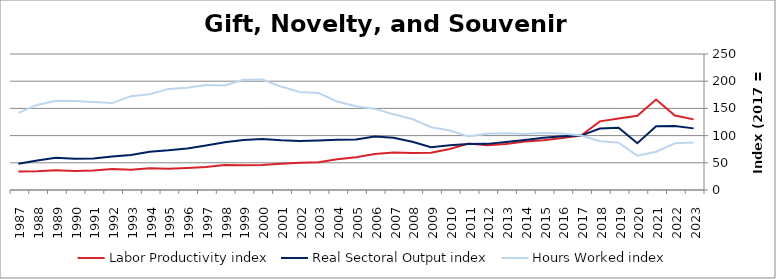
| Category | Labor Productivity index | Real Sectoral Output index | Hours Worked index |
|---|---|---|---|
| 2023.0 | 129.848 | 113.267 | 87.231 |
| 2022.0 | 137.019 | 117.731 | 85.923 |
| 2021.0 | 166.224 | 117.076 | 70.433 |
| 2020.0 | 136.283 | 86.102 | 63.179 |
| 2019.0 | 131.521 | 114.574 | 87.115 |
| 2018.0 | 126.127 | 113.036 | 89.621 |
| 2017.0 | 100 | 100 | 100 |
| 2016.0 | 95.467 | 98.997 | 103.698 |
| 2015.0 | 91.502 | 96.053 | 104.974 |
| 2014.0 | 89.359 | 92.098 | 103.065 |
| 2013.0 | 84.581 | 88.285 | 104.379 |
| 2012.0 | 82.145 | 84.794 | 103.224 |
| 2011.0 | 85.568 | 84.377 | 98.608 |
| 2010.0 | 75.236 | 82.262 | 109.338 |
| 2009.0 | 68.289 | 78.807 | 115.401 |
| 2008.0 | 67.904 | 88.556 | 130.413 |
| 2007.0 | 69.002 | 96.051 | 139.2 |
| 2006.0 | 66.024 | 98.419 | 149.065 |
| 2005.0 | 60.254 | 92.763 | 153.953 |
| 2004.0 | 56.725 | 92.224 | 162.579 |
| 2003.0 | 50.999 | 90.948 | 178.333 |
| 2002.0 | 50.116 | 90.257 | 180.095 |
| 2001.0 | 48.154 | 91.548 | 190.114 |
| 2000.0 | 46.156 | 93.724 | 203.06 |
| 1999.0 | 45.377 | 91.892 | 202.506 |
| 1998.0 | 45.729 | 87.834 | 192.076 |
| 1997.0 | 42.431 | 81.901 | 193.024 |
| 1996.0 | 40.631 | 76.318 | 187.834 |
| 1995.0 | 39.198 | 72.864 | 185.886 |
| 1994.0 | 39.961 | 70.274 | 175.855 |
| 1993.0 | 37.206 | 64.195 | 172.539 |
| 1992.0 | 38.509 | 61.531 | 159.785 |
| 1991.0 | 35.779 | 57.919 | 161.879 |
| 1990.0 | 35.123 | 57.533 | 163.806 |
| 1989.0 | 36.124 | 59.32 | 164.213 |
| 1988.0 | 34.6 | 54.099 | 156.355 |
| 1987.0 | 34.169 | 48.446 | 141.784 |